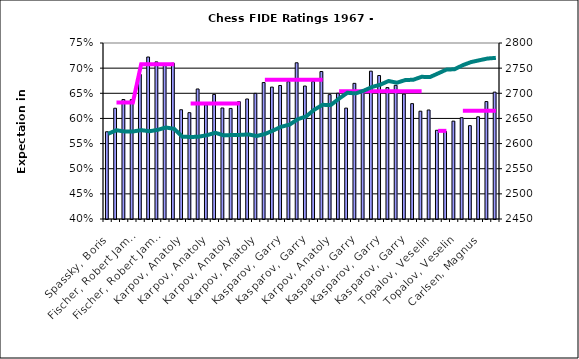
| Category | Expectation |
|---|---|
| Spassky, Boris | 0.573 |
| Fischer, Robert James | 0.62 |
| Fischer, Robert James | 0.638 |
| Fischer, Robert James | 0.637 |
| Fischer, Robert James | 0.687 |
| Fischer, Robert James | 0.722 |
| Fischer, Robert James | 0.712 |
| Fischer, Robert James | 0.706 |
| Fischer, Robert James | 0.71 |
| Karpov, Anatoly | 0.617 |
| Karpov, Anatoly | 0.611 |
| Karpov, Anatoly | 0.659 |
| Karpov, Anatoly | 0.627 |
| Karpov, Anatoly | 0.648 |
| Karpov, Anatoly | 0.621 |
| Karpov, Anatoly | 0.62 |
| Karpov, Anatoly | 0.633 |
| Kasparov, Garry | 0.639 |
| Karpov, Anatoly | 0.65 |
| Kasparov, Garry | 0.671 |
| Kasparov, Garry | 0.662 |
| Kasparov, Garry | 0.665 |
| Kasparov, Garry | 0.673 |
| Kasparov, Garry | 0.711 |
| Kasparov, Garry | 0.664 |
| Kasparov, Garry | 0.673 |
| Kasparov, Garry | 0.693 |
| Karpov, Anatoly | 0.647 |
| Kasparov, Garry | 0.65 |
| Kasparov, Garry | 0.62 |
| Kasparov, Garry | 0.67 |
| Kasparov, Garry | 0.656 |
| Kasparov, Garry | 0.694 |
| Kasparov, Garry | 0.685 |
| Kasparov, Garry | 0.661 |
| Kasparov, Garry | 0.666 |
| Kasparov, Garry | 0.648 |
| Kasparov, Garry | 0.629 |
| Kasparov, Garry | 0.614 |
| Topalov, Veselin | 0.617 |
| Anand, Viswanathan | 0.576 |
| Anand, Viswanathan | 0.574 |
| Topalov, Veselin | 0.595 |
| Carlsen, Magnus | 0.601 |
| Carlsen, Magnus | 0.586 |
| Carlsen, Magnus | 0.603 |
| Carlsen, Magnus | 0.634 |
| Carlsen, Magnus | 0.652 |